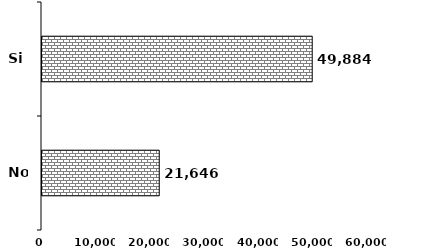
| Category | Series 0 |
|---|---|
| No | 21646 |
| Si | 49884 |